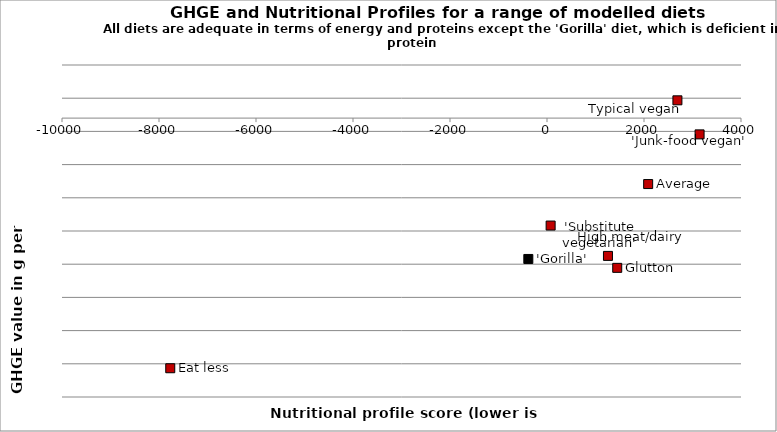
| Category | Series 0 |
|---|---|
| 2086.0 | 4207 |
| 2689.0 | 5468 |
| 1448.0 | 2945 |
| -7768.0 | 1433 |
| -385.0 | 3079 |
| 1257.0 | 3125 |
| 3146.0 | 4955 |
| 75.0 | 3582 |